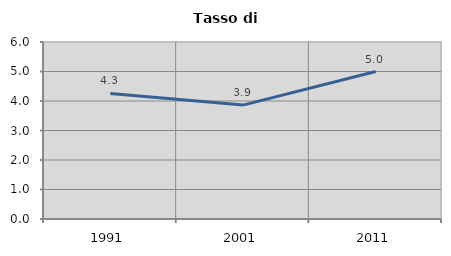
| Category | Tasso di disoccupazione   |
|---|---|
| 1991.0 | 4.256 |
| 2001.0 | 3.861 |
| 2011.0 | 4.999 |